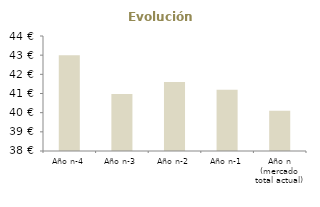
| Category | Evolución Facturación |
|---|---|
| Año n-4 | 43 |
| Año n-3 | 40.98 |
| Año n-2 | 41.6 |
| Año n-1 | 41.2 |
| Año n (mercado total actual) | 40.1 |